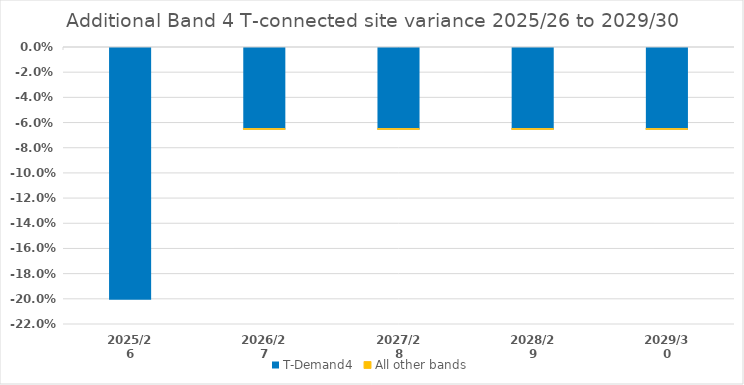
| Category | T-Demand4 | All other bands |
|---|---|---|
| 2025/26 | -0.2 | 0 |
| 2026/27 | -0.065 | -0.001 |
| 2027/28 | -0.065 | -0.001 |
| 2028/29 | -0.065 | -0.001 |
| 2029/30 | -0.065 | -0.001 |